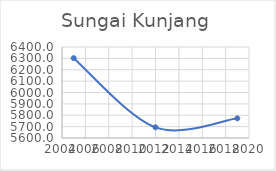
| Category | Series 0 |
|---|---|
| 2005.0 | 6301.857 |
| 2012.0 | 5693.941 |
| 2019.0 | 5773.169 |